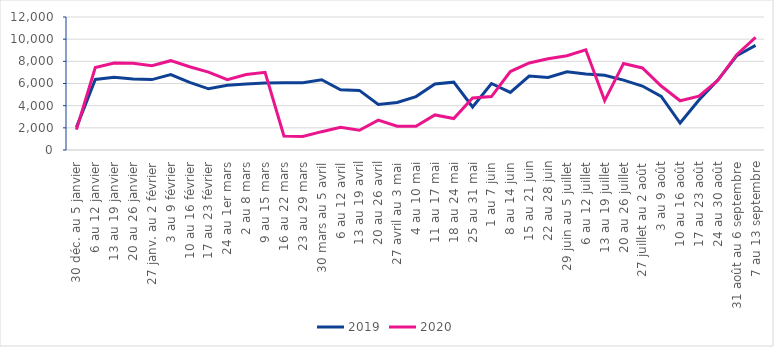
| Category | 2019 | 2020 |
|---|---|---|
| 30 déc. au 5 janvier | 2040 | 1844 |
| 6 au 12 janvier | 6370 | 7441 |
| 13 au 19 janvier | 6554 | 7851 |
| 20 au 26 janvier | 6407 | 7829 |
| 27 janv. au 2 février | 6351 | 7601 |
| 3 au 9 février | 6808 | 8059 |
| 10 au 16 février | 6108 | 7516 |
| 17 au 23 février | 5521 | 7023 |
| 24 au 1er mars | 5849 | 6341 |
| 2 au 8 mars | 5944 | 6816 |
| 9 au 15 mars | 6046 | 7004 |
| 16 au 22 mars | 6069 | 1260 |
| 23 au 29 mars | 6072 | 1214 |
| 30 mars au 5 avril | 6339 | 1654 |
| 6 au 12 avril | 5437 | 2049 |
| 13 au 19 avril | 5376 | 1786 |
| 20 au 26 avril | 4100 | 2692 |
| 27 avril au 3 mai | 4284 | 2153 |
| 4 au 10 mai | 4818 | 2134 |
| 11 au 17 mai | 5953 | 3164 |
| 18 au 24 mai | 6120 | 2840 |
| 25 au 31 mai | 3877 | 4686 |
| 1 au 7 juin | 5999 | 4823 |
| 8 au 14 juin | 5197 | 7081 |
| 15 au 21 juin | 6668 | 7853 |
| 22 au 28 juin | 6548 | 8228 |
| 29 juin au 5 juillet | 7057 | 8511 |
| 6 au 12 juillet | 6862 | 9036 |
| 13 au 19 juillet | 6737 | 4457 |
| 20 au 26 juillet | 6309 | 7808 |
| 27 juillet au 2 août | 5772 | 7400 |
| 3 au 9 août | 4840 | 5775 |
| 10 au 16 août | 2432 | 4439 |
| 17 au 23 août | 4517 | 4862 |
| 24 au 30 août | 6304 | 6286 |
| 31 août au 6 septembre | 8500 | 8597 |
| 7 au 13 septembre | 9436 | 10152 |